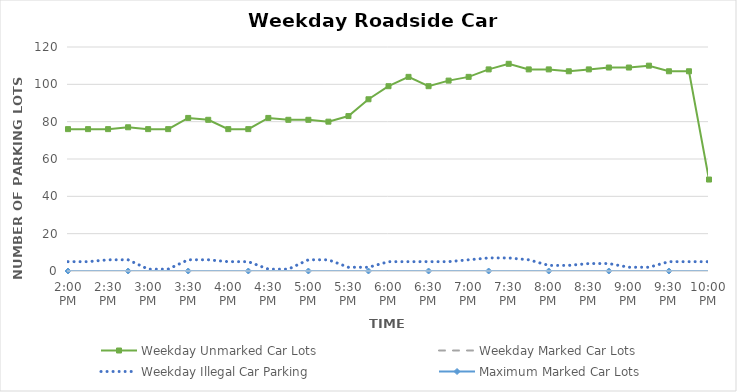
| Category | Weekday Unmarked Car Lots | Weekday Marked Car Lots | Weekday Illegal Car Parking | Maximum Marked Car Lots |
|---|---|---|---|---|
| 0.5833333333333334 | 76 | 0 | 5 | 0 |
| 0.59375 | 76 | 0 | 5 | 0 |
| 0.604166666666667 | 76 | 0 | 6 | 0 |
| 0.614583333333334 | 77 | 0 | 6 | 0 |
| 0.625 | 76 | 0 | 1 | 0 |
| 0.635416666666667 | 76 | 0 | 1 | 0 |
| 0.645833333333334 | 82 | 0 | 6 | 0 |
| 0.656250000000001 | 81 | 0 | 6 | 0 |
| 0.666666666666667 | 76 | 0 | 5 | 0 |
| 0.677083333333334 | 76 | 0 | 5 | 0 |
| 0.687500000000001 | 82 | 0 | 1 | 0 |
| 0.697916666666668 | 81 | 0 | 1 | 0 |
| 0.708333333333335 | 81 | 0 | 6 | 0 |
| 0.718750000000001 | 80 | 0 | 6 | 0 |
| 0.729166666666668 | 83 | 0 | 2 | 0 |
| 0.739583333333335 | 92 | 0 | 2 | 0 |
| 0.750000000000002 | 99 | 0 | 5 | 0 |
| 0.760416666666668 | 104 | 0 | 5 | 0 |
| 0.770833333333335 | 99 | 0 | 5 | 0 |
| 0.781250000000002 | 102 | 0 | 5 | 0 |
| 0.791666666666669 | 104 | 0 | 6 | 0 |
| 0.802083333333335 | 108 | 0 | 7 | 0 |
| 0.812500000000002 | 111 | 0 | 7 | 0 |
| 0.822916666666669 | 108 | 0 | 6 | 0 |
| 0.833333333333336 | 108 | 0 | 3 | 0 |
| 0.843750000000002 | 107 | 0 | 3 | 0 |
| 0.854166666666669 | 108 | 0 | 4 | 0 |
| 0.864583333333336 | 109 | 0 | 4 | 0 |
| 0.875000000000002 | 109 | 0 | 2 | 0 |
| 0.885416666666669 | 110 | 0 | 2 | 0 |
| 0.895833333333336 | 107 | 0 | 5 | 0 |
| 0.906250000000003 | 107 | 0 | 5 | 0 |
| 0.916666666666669 | 49 | 0 | 5 | 0 |